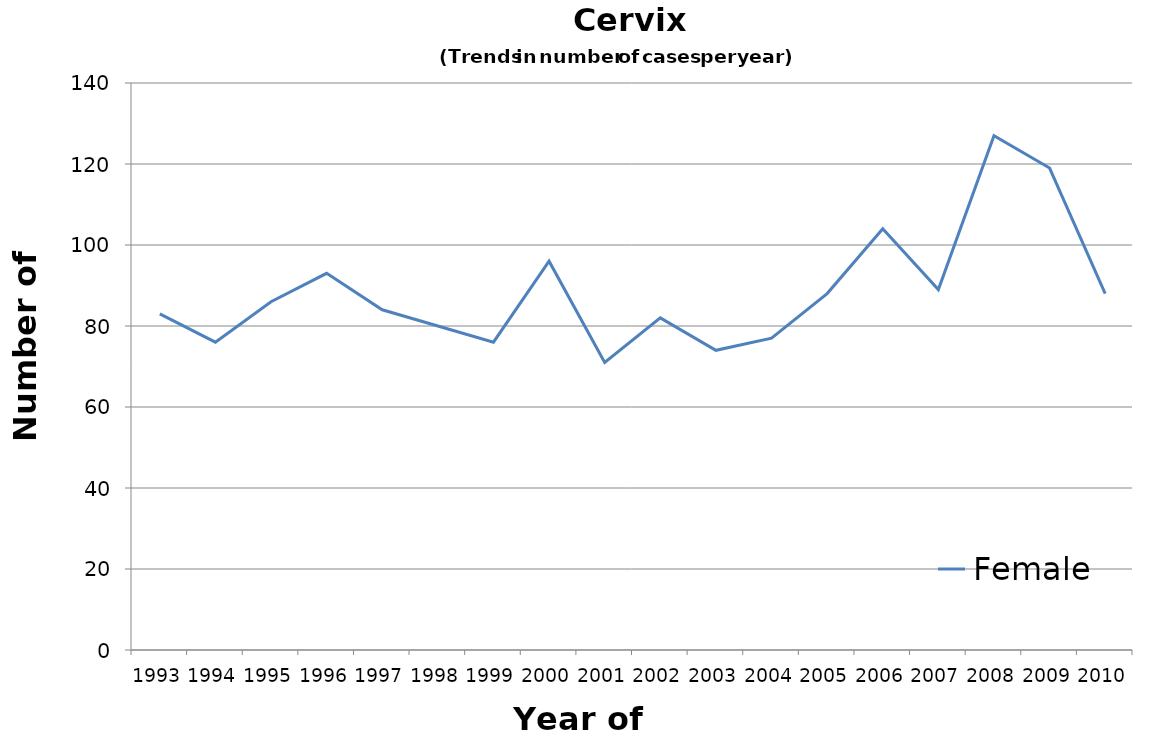
| Category | Female |
|---|---|
| 1993.0 | 83 |
| 1994.0 | 76 |
| 1995.0 | 86 |
| 1996.0 | 93 |
| 1997.0 | 84 |
| 1998.0 | 80 |
| 1999.0 | 76 |
| 2000.0 | 96 |
| 2001.0 | 71 |
| 2002.0 | 82 |
| 2003.0 | 74 |
| 2004.0 | 77 |
| 2005.0 | 88 |
| 2006.0 | 104 |
| 2007.0 | 89 |
| 2008.0 | 127 |
| 2009.0 | 119 |
| 2010.0 | 88 |